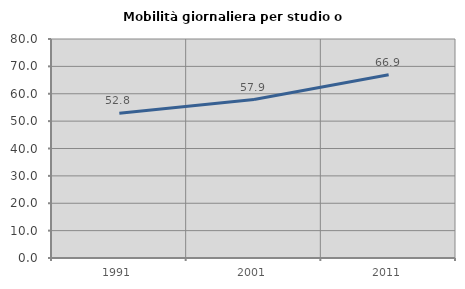
| Category | Mobilità giornaliera per studio o lavoro |
|---|---|
| 1991.0 | 52.846 |
| 2001.0 | 57.895 |
| 2011.0 | 66.929 |